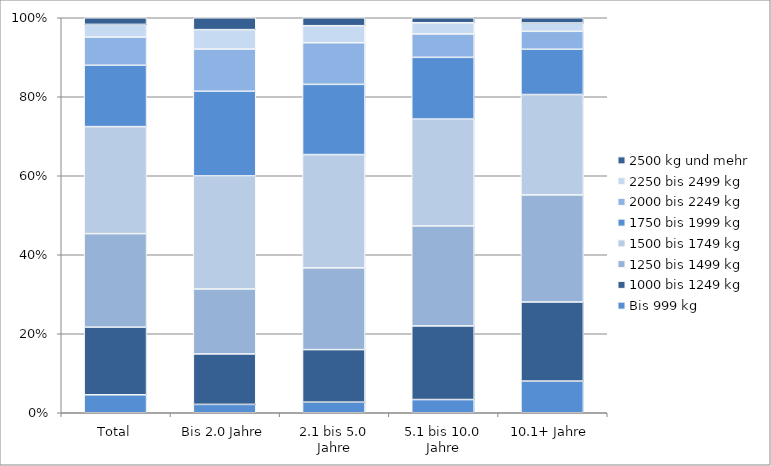
| Category | Bis 999 kg | 1000 bis 1249 kg | 1250 bis 1499 kg | 1500 bis 1749 kg | 1750 bis 1999 kg | 2000 bis 2249 kg | 2250 bis 2499 kg | 2500 kg und mehr |
|---|---|---|---|---|---|---|---|---|
| Total | 1376 | 5177 | 7164 | 8194 | 4699 | 2160 | 969 | 509 |
| Bis 2.0 Jahre | 86 | 519 | 668 | 1163 | 871 | 434 | 200 | 122 |
| 2.1 bis 5.0 Jahre | 180 | 892 | 1388 | 1923 | 1192 | 707 | 289 | 135 |
| 5.1 bis 10.0 Jahre | 323 | 1801 | 2447 | 2614 | 1511 | 573 | 273 | 122 |
| 10.1+ Jahre | 787 | 1965 | 2661 | 2494 | 1125 | 446 | 207 | 130 |